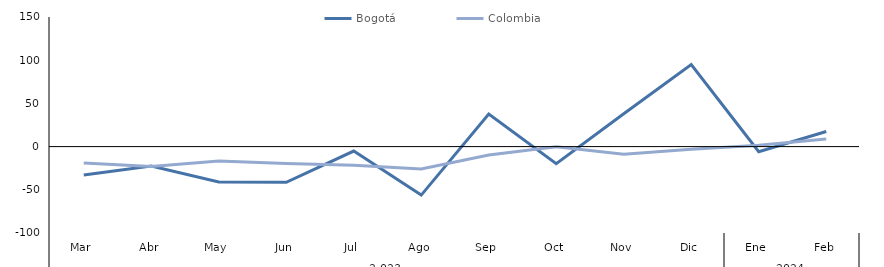
| Category | Bogotá | Colombia |
|---|---|---|
| 0 | -32.857 | -18.851 |
| 1 | -22.424 | -23.027 |
| 2 | -40.86 | -16.576 |
| 3 | -41.304 | -19.639 |
| 4 | -5.147 | -21.546 |
| 5 | -56.169 | -25.989 |
| 6 | 37.561 | -9.809 |
| 7 | -19.838 | -0.253 |
| 8 | 38.037 | -8.979 |
| 9 | 94.964 | -3.018 |
| 10 | -5.97 | 1.614 |
| 11 | 17.532 | 8.926 |